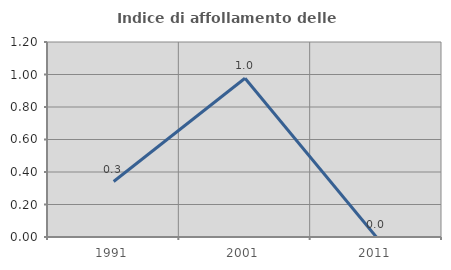
| Category | Indice di affollamento delle abitazioni  |
|---|---|
| 1991.0 | 0.341 |
| 2001.0 | 0.977 |
| 2011.0 | 0 |